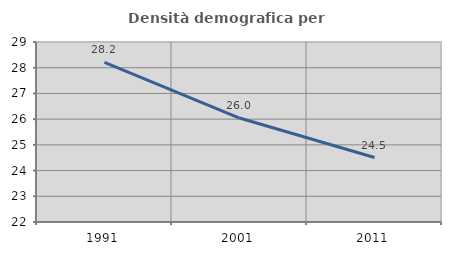
| Category | Densità demografica |
|---|---|
| 1991.0 | 28.209 |
| 2001.0 | 26.043 |
| 2011.0 | 24.507 |